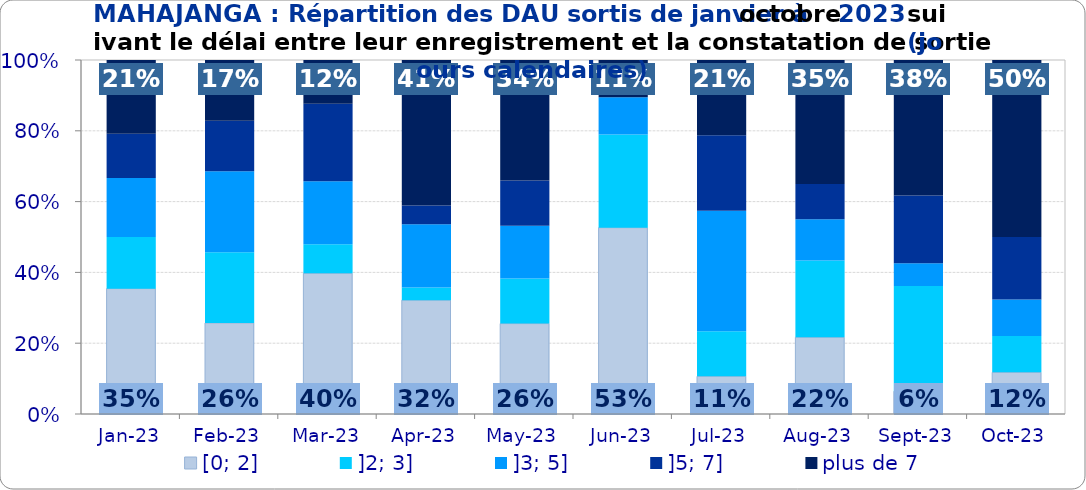
| Category | [0; 2] | ]2; 3] | ]3; 5] | ]5; 7] | plus de 7 |
|---|---|---|---|---|---|
| 2023-01-01 | 0.354 | 0.146 | 0.167 | 0.125 | 0.208 |
| 2023-02-01 | 0.257 | 0.2 | 0.229 | 0.143 | 0.171 |
| 2023-03-01 | 0.397 | 0.082 | 0.178 | 0.219 | 0.123 |
| 2023-04-01 | 0.321 | 0.036 | 0.179 | 0.054 | 0.411 |
| 2023-05-01 | 0.255 | 0.128 | 0.149 | 0.128 | 0.34 |
| 2023-06-01 | 0.526 | 0.263 | 0.105 | 0 | 0.105 |
| 2023-07-01 | 0.106 | 0.128 | 0.34 | 0.213 | 0.213 |
| 2023-08-01 | 0.217 | 0.217 | 0.117 | 0.1 | 0.35 |
| 2023-09-01 | 0.064 | 0.298 | 0.064 | 0.191 | 0.383 |
| 2023-10-01 | 0.118 | 0.103 | 0.103 | 0.176 | 0.5 |